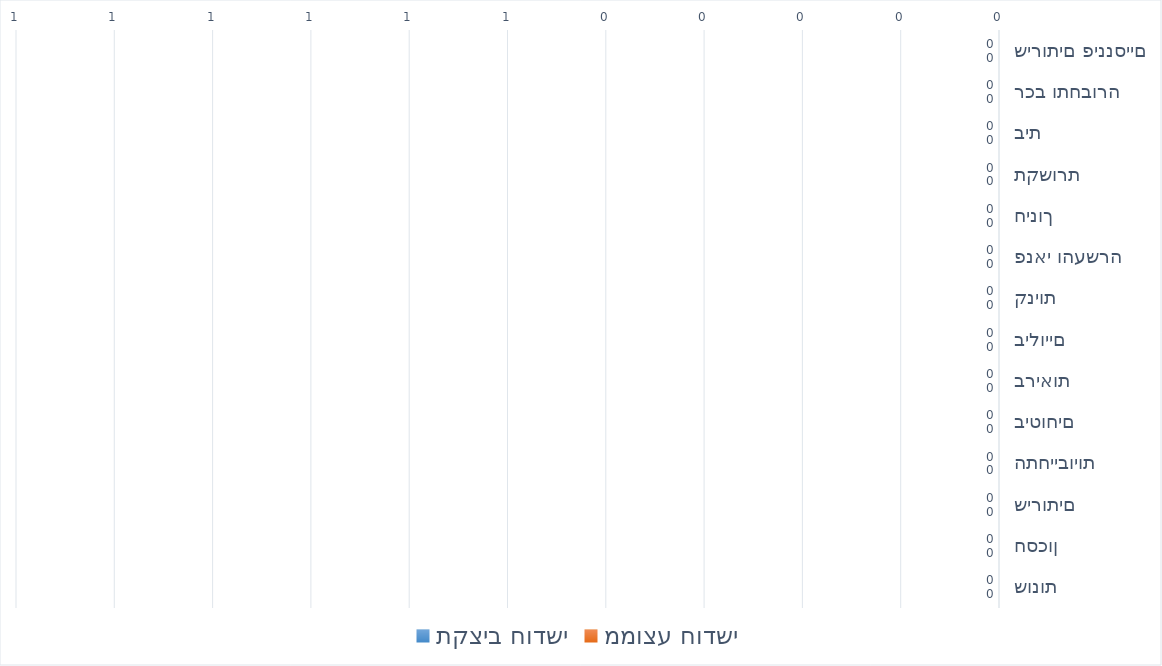
| Category | תקציב חודשי | ממוצע חודשי |
|---|---|---|
| שירותים פיננסיים | 0 | 0 |
| רכב ותחבורה | 0 | 0 |
| בית | 0 | 0 |
| תקשורת | 0 | 0 |
| חינוך | 0 | 0 |
| פנאי והעשרה | 0 | 0 |
| קניות | 0 | 0 |
| בילויים | 0 | 0 |
| בריאות | 0 | 0 |
| ביטוחים | 0 | 0 |
| התחייבויות | 0 | 0 |
| שירותים | 0 | 0 |
| חסכון | 0 | 0 |
| שונות | 0 | 0 |